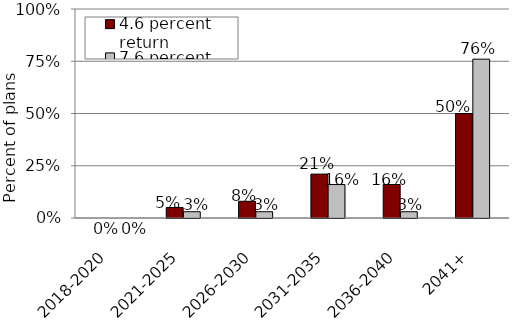
| Category | 4.6 percent return | 7.6 percent return |
|---|---|---|
| 2018-2020 | 0 | 0 |
| 2021-2025 | 0.05 | 0.03 |
| 2026-2030 | 0.08 | 0.03 |
| 2031-2035 | 0.21 | 0.16 |
| 2036-2040 | 0.16 | 0.03 |
| 2041+ | 0.5 | 0.76 |